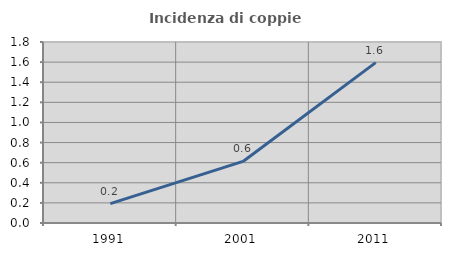
| Category | Incidenza di coppie miste |
|---|---|
| 1991.0 | 0.193 |
| 2001.0 | 0.612 |
| 2011.0 | 1.595 |